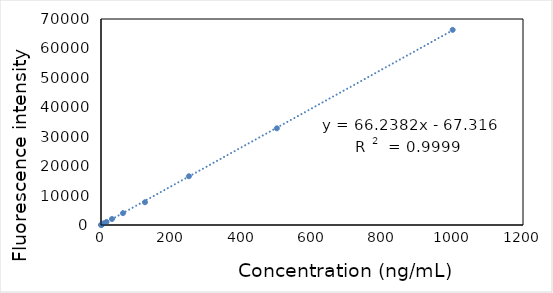
| Category | -blank |
|---|---|
| 1000.0 | 66310 |
| 500.0 | 32857.667 |
| 250.0 | 16562 |
| 125.0 | 7730.667 |
| 62.5 | 4022 |
| 31.2 | 2033.333 |
| 15.6 | 1045.667 |
| 7.8 | 581.333 |
| 3.9 | 271.667 |
| 1.95 | 134.667 |
| 0.975 | 48.333 |
| 0.0 | 0 |